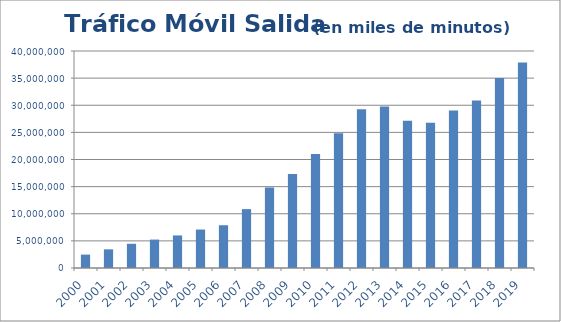
| Category | Tráfico Salida  en miles de minutos  |
|---|---|
| 2000 | 2471208.216 |
| 2001 | 3441736.145 |
| 2002 | 4464101.558 |
| 2003 | 5237945.688 |
| 2004 | 6003889.136 |
| 2005 | 7089121.671 |
| 2006 | 7881070.445 |
| 2007 | 10857829.097 |
| 2008 | 14842544.992 |
| 2009 | 17315937.37 |
| 2010 | 21012307.587 |
| 2011 | 24832335.384 |
| 2012 | 29284513.139 |
| 2013 | 29748487.795 |
| 2014 | 27120732.321 |
| 2015 | 26759882.276 |
| 2016 | 29023085.247 |
| 2017 | 30893589.798 |
| 2018 | 35010096.544 |
| 2019 | 37859939.438 |